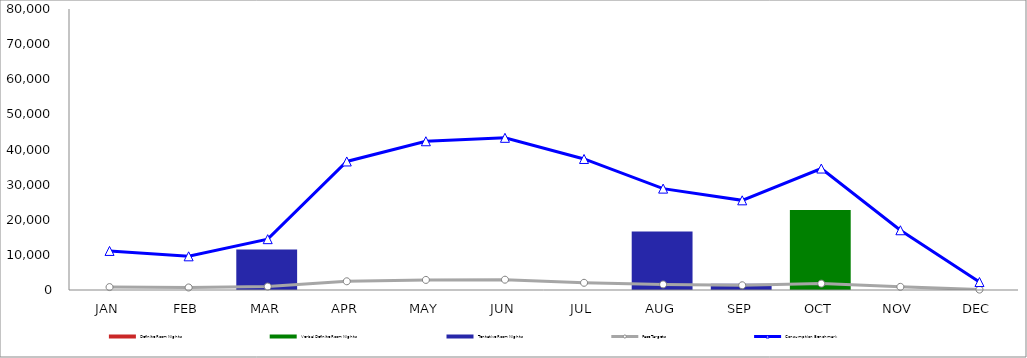
| Category | Definite Room Nights | Verbal Definite Room Nights | Tentative Room Nights |
|---|---|---|---|
| JAN | 0 | 0 | 0 |
| FEB | 0 | 0 | 0 |
| MAR | 0 | 0 | 11499 |
| APR | 0 | 0 | 0 |
| MAY | 0 | 0 | 0 |
| JUN | 0 | 0 | 0 |
| JUL | 0 | 0 | 0 |
| AUG | 0 | 0 | 16625 |
| SEP | 0 | 0 | 1750 |
| OCT | 0 | 22743 | 0 |
| NOV | 0 | 0 | 0 |
| DEC | 0 | 0 | 0 |